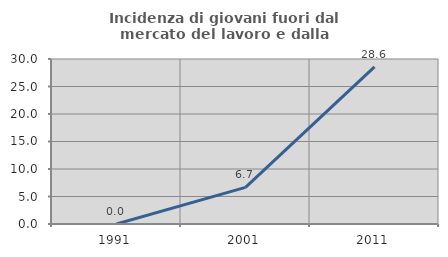
| Category | Incidenza di giovani fuori dal mercato del lavoro e dalla formazione  |
|---|---|
| 1991.0 | 0 |
| 2001.0 | 6.667 |
| 2011.0 | 28.571 |